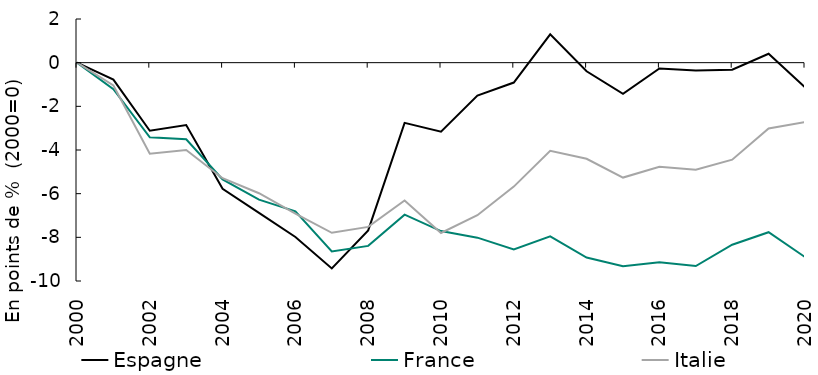
| Category | Espagne | France | Italie |
|---|---|---|---|
| 2000 | 0 | 0 | 0 |
| 2001 | -0.776 | -1.213 | -1.044 |
| 2002 | -3.116 | -3.42 | -4.174 |
| 2003 | -2.855 | -3.507 | -3.999 |
| 2004 | -5.776 | -5.347 | -5.292 |
| 2005 | -6.879 | -6.274 | -5.98 |
| 2006 | -7.986 | -6.809 | -6.918 |
| 2007 | -9.424 | -8.645 | -7.791 |
| 2008 | -7.684 | -8.391 | -7.521 |
| 2009 | -2.758 | -6.962 | -6.312 |
| 2010 | -3.162 | -7.713 | -7.801 |
| 2011 | -1.506 | -8.015 | -6.989 |
| 2012 | -0.91 | -8.556 | -5.677 |
| 2013 | 1.295 | -7.952 | -4.04 |
| 2014 | -0.394 | -8.923 | -4.403 |
| 2015 | -1.43 | -9.321 | -5.262 |
| 2016 | -0.264 | -9.141 | -4.769 |
| 2017 | -0.358 | -9.313 | -4.906 |
| 2018 | -0.326 | -8.338 | -4.445 |
| 2019 | 0.406 | -7.766 | -3.017 |
| 2020 | -1.127 | -8.905 | -2.716 |